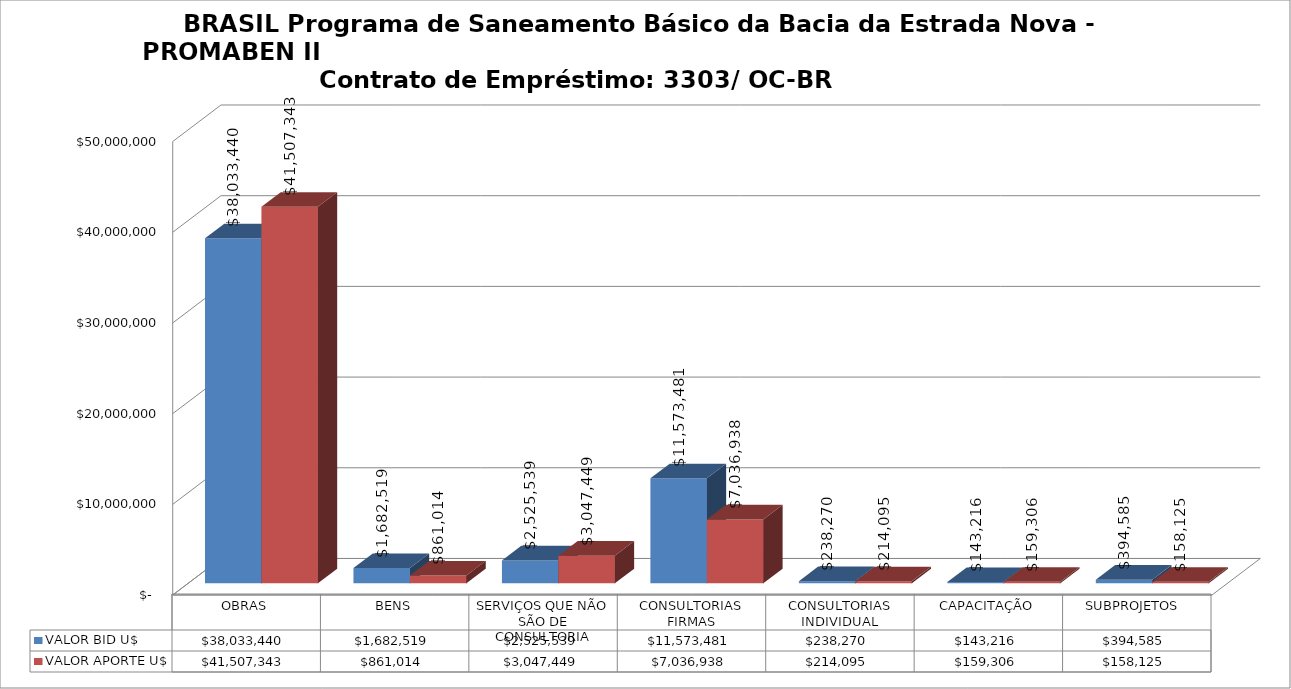
| Category | VALOR BID U$ | VALOR APORTE U$ |
|---|---|---|
| OBRAS | 38033439.805 | 41507343.465 |
| BENS | 1682518.903 | 861014.229 |
| SERVIÇOS QUE NÃO SÃO DE CONSULTORIA | 2525539.168 | 3047449.022 |
| CONSULTORIAS FIRMAS | 11573480.826 | 7036937.734 |
| CONSULTORIAS INDIVIDUAL | 238270.403 | 214095.497 |
| CAPACITAÇÃO | 143215.63 | 159305.97 |
| SUBPROJETOS  | 394584.946 | 158124.824 |